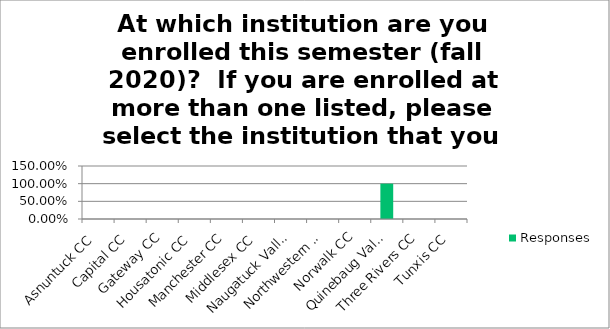
| Category | Responses |
|---|---|
| Asnuntuck CC | 0 |
| Capital CC | 0 |
| Gateway CC | 0 |
| Housatonic CC | 0 |
| Manchester CC | 0 |
| Middlesex CC | 0 |
| Naugatuck Valley CC | 0 |
| Northwestern CT CC | 0 |
| Norwalk CC | 0 |
| Quinebaug Valley CC | 1 |
| Three Rivers CC | 0 |
| Tunxis CC | 0 |